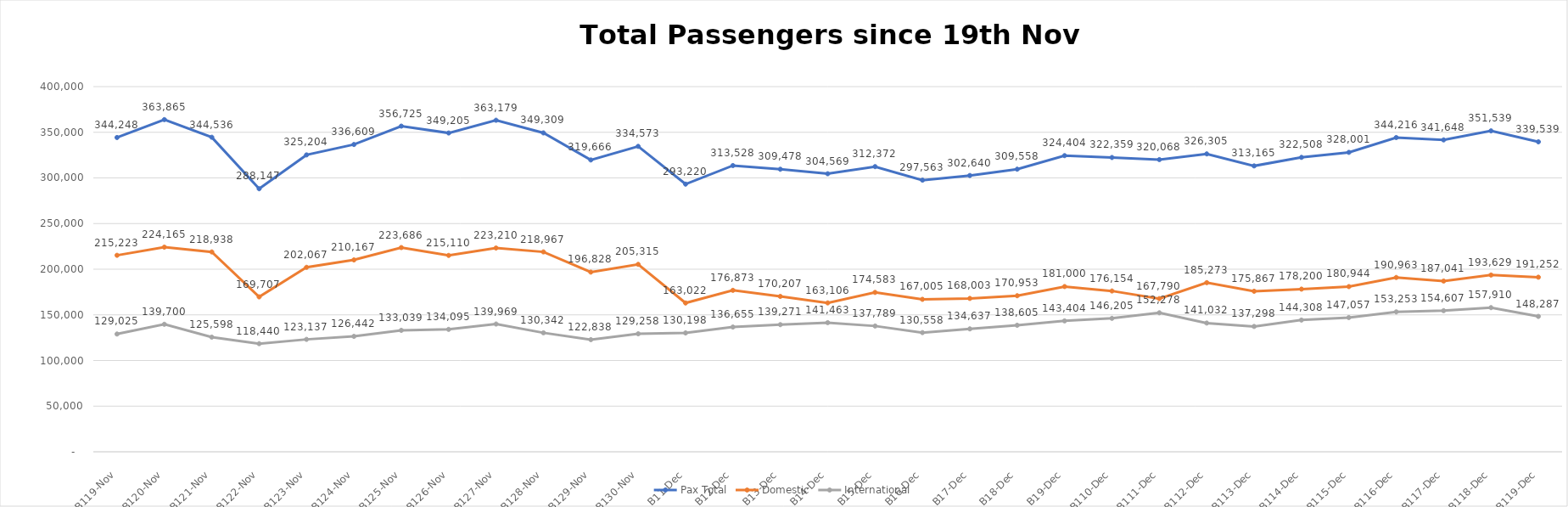
| Category | Pax Total |  Domestic  |  International  |
|---|---|---|---|
| 2022-11-19 | 344248 | 215223 | 129025 |
| 2022-11-20 | 363865 | 224165 | 139700 |
| 2022-11-21 | 344536 | 218938 | 125598 |
| 2022-11-22 | 288147 | 169707 | 118440 |
| 2022-11-23 | 325204 | 202067 | 123137 |
| 2022-11-24 | 336609 | 210167 | 126442 |
| 2022-11-25 | 356725 | 223686 | 133039 |
| 2022-11-26 | 349205 | 215110 | 134095 |
| 2022-11-27 | 363179 | 223210 | 139969 |
| 2022-11-28 | 349309 | 218967 | 130342 |
| 2022-11-29 | 319666 | 196828 | 122838 |
| 2022-11-30 | 334573 | 205315 | 129258 |
| 2022-12-01 | 293220 | 163022 | 130198 |
| 2022-12-02 | 313528 | 176873 | 136655 |
| 2022-12-03 | 309478 | 170207 | 139271 |
| 2022-12-04 | 304569 | 163106 | 141463 |
| 2022-12-05 | 312372 | 174583 | 137789 |
| 2022-12-06 | 297563 | 167005 | 130558 |
| 2022-12-07 | 302640 | 168003 | 134637 |
| 2022-12-08 | 309558 | 170953 | 138605 |
| 2022-12-09 | 324404 | 181000 | 143404 |
| 2022-12-10 | 322359 | 176154 | 146205 |
| 2022-12-11 | 320068 | 167790 | 152278 |
| 2022-12-12 | 326305 | 185273 | 141032 |
| 2022-12-13 | 313165 | 175867 | 137298 |
| 2022-12-14 | 322508 | 178200 | 144308 |
| 2022-12-15 | 328001 | 180944 | 147057 |
| 2022-12-16 | 344216 | 190963 | 153253 |
| 2022-12-17 | 341648 | 187041 | 154607 |
| 2022-12-18 | 351539 | 193629 | 157910 |
| 2022-12-19 | 339539 | 191252 | 148287 |